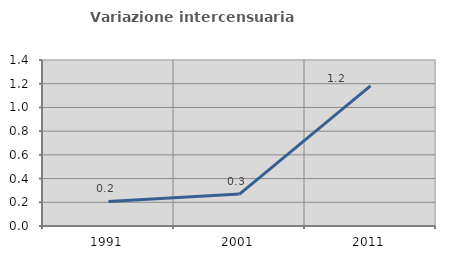
| Category | Variazione intercensuaria annua |
|---|---|
| 1991.0 | 0.207 |
| 2001.0 | 0.269 |
| 2011.0 | 1.181 |